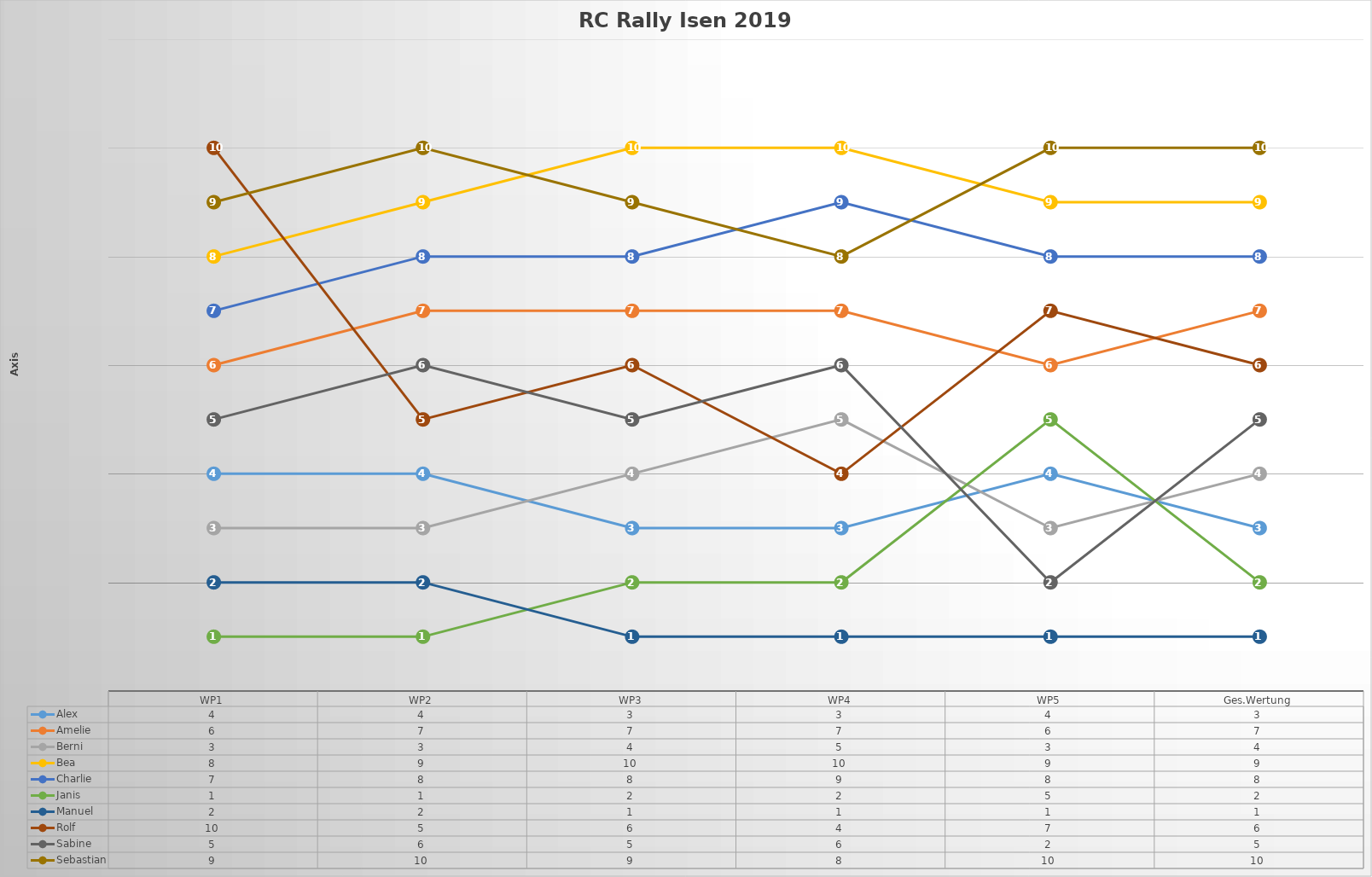
| Category | Alex | Amelie | Berni | Bea | Charlie | Janis | Manuel | Rolf | Sabine | Sebastian |
|---|---|---|---|---|---|---|---|---|---|---|
| WP1 | 4 | 6 | 3 | 8 | 7 | 1 | 2 | 10 | 5 | 9 |
| WP2 | 4 | 7 | 3 | 9 | 8 | 1 | 2 | 5 | 6 | 10 |
| WP3 | 3 | 7 | 4 | 10 | 8 | 2 | 1 | 6 | 5 | 9 |
| WP4 | 3 | 7 | 5 | 10 | 9 | 2 | 1 | 4 | 6 | 8 |
| WP5 | 4 | 6 | 3 | 9 | 8 | 5 | 1 | 7 | 2 | 10 |
| Ges.Wertung | 3 | 7 | 4 | 9 | 8 | 2 | 1 | 6 | 5 | 10 |